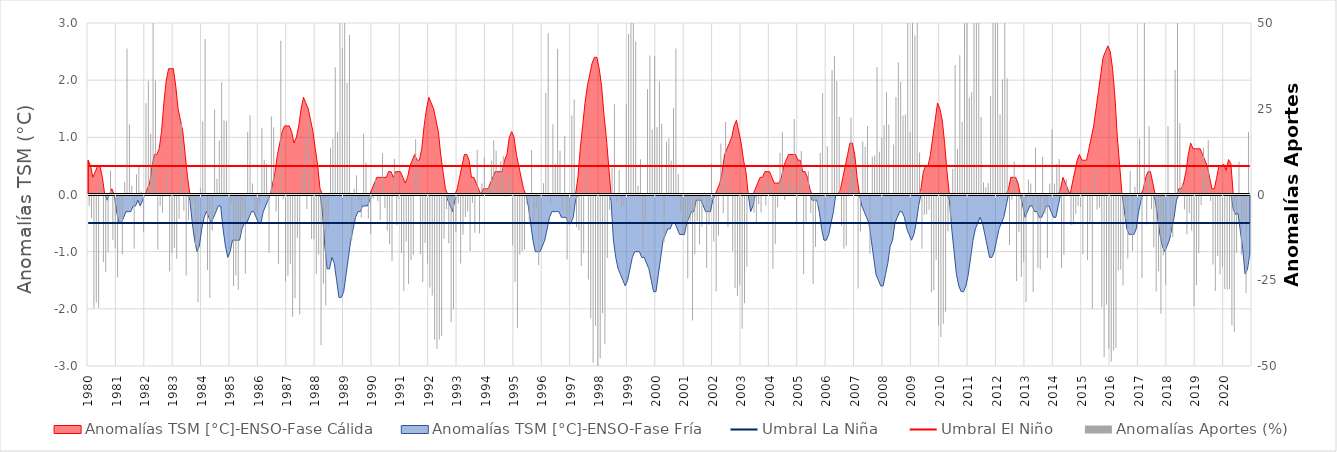
| Category | Anomalías Aportes (%) |
|---|---|
| 0 | -2.96 |
| 1 | -6.65 |
| 2 | -32.91 |
| 3 | -31.22 |
| 4 | -32.69 |
| 5 | 4.04 |
| 6 | -19.42 |
| 7 | -22.35 |
| 8 | -16.59 |
| 9 | 7.02 |
| 10 | -12.93 |
| 11 | -15.38 |
| 12 | -23.91 |
| 13 | -6.87 |
| 14 | -17.14 |
| 15 | 3.58 |
| 16 | 42.54 |
| 17 | 20.41 |
| 18 | 2.54 |
| 19 | -15.54 |
| 20 | 5.87 |
| 21 | 7.93 |
| 22 | 0.89 |
| 23 | -10.68 |
| 24 | 26.58 |
| 25 | 33.17 |
| 26 | 17.7 |
| 27 | 62.43 |
| 28 | 33.25 |
| 29 | -15.72 |
| 30 | -2.98 |
| 31 | -5.06 |
| 32 | -0.26 |
| 33 | 6.89 |
| 34 | -22.16 |
| 35 | -16.73 |
| 36 | -15.21 |
| 37 | -18.44 |
| 38 | -6.8 |
| 39 | 21.37 |
| 40 | -4.4 |
| 41 | -23.31 |
| 42 | -7.22 |
| 43 | -2.01 |
| 44 | -2.18 |
| 45 | -14.49 |
| 46 | -31.14 |
| 47 | 1.85 |
| 48 | 21.28 |
| 49 | 45.3 |
| 50 | -21.75 |
| 51 | -29.86 |
| 52 | -10.21 |
| 53 | 24.8 |
| 54 | 4.56 |
| 55 | 15.72 |
| 56 | 32.71 |
| 57 | 21.58 |
| 58 | 21.38 |
| 59 | -0.7 |
| 60 | -2.57 |
| 61 | -26.3 |
| 62 | -23.34 |
| 63 | -27.51 |
| 64 | -11.14 |
| 65 | -5.73 |
| 66 | -22.79 |
| 67 | 18.3 |
| 68 | 23.13 |
| 69 | 3.23 |
| 70 | -5.02 |
| 71 | -4.34 |
| 72 | -2.4 |
| 73 | 19.45 |
| 74 | 10.15 |
| 75 | 8.98 |
| 76 | -16.62 |
| 77 | 22.73 |
| 78 | 19.6 |
| 79 | -4.63 |
| 80 | -19.9 |
| 81 | 44.84 |
| 82 | -1.12 |
| 83 | -25.06 |
| 84 | -23.43 |
| 85 | -19.94 |
| 86 | -35.36 |
| 87 | -29.94 |
| 88 | -12.31 |
| 89 | -34.73 |
| 90 | 6.76 |
| 91 | 16.97 |
| 92 | -3.94 |
| 93 | 22.32 |
| 94 | -12.71 |
| 95 | -12.76 |
| 96 | -22.9 |
| 97 | -17.21 |
| 98 | -43.68 |
| 99 | -25.67 |
| 100 | -32.05 |
| 101 | -9.55 |
| 102 | 13.65 |
| 103 | 16.23 |
| 104 | 37.09 |
| 105 | 18.27 |
| 106 | 51.03 |
| 107 | 42.66 |
| 108 | 58.47 |
| 109 | 32.61 |
| 110 | 46.47 |
| 111 | -13.29 |
| 112 | 1.69 |
| 113 | 5.63 |
| 114 | -1.6 |
| 115 | -6.52 |
| 116 | 17.73 |
| 117 | 9.33 |
| 118 | -6.7 |
| 119 | -11.24 |
| 120 | -0.86 |
| 121 | 4.59 |
| 122 | -1.69 |
| 123 | -7.25 |
| 124 | 12.01 |
| 125 | -3.7 |
| 126 | -10.18 |
| 127 | -14.21 |
| 128 | -19.06 |
| 129 | 10.4 |
| 130 | -8.69 |
| 131 | -1.04 |
| 132 | -16.76 |
| 133 | -27.83 |
| 134 | -13.43 |
| 135 | -25.85 |
| 136 | -18.85 |
| 137 | -17.36 |
| 138 | 16.13 |
| 139 | 9.88 |
| 140 | -17.15 |
| 141 | -25.31 |
| 142 | -13.88 |
| 143 | -19.84 |
| 144 | -26.81 |
| 145 | -29.17 |
| 146 | -41.97 |
| 147 | -44.66 |
| 148 | -41.98 |
| 149 | -40.96 |
| 150 | -12.58 |
| 151 | -4.02 |
| 152 | -13.93 |
| 153 | -36.97 |
| 154 | -33.13 |
| 155 | -10.63 |
| 156 | -2.32 |
| 157 | -19.83 |
| 158 | -11.47 |
| 159 | -6.27 |
| 160 | -4.65 |
| 161 | -16.16 |
| 162 | -2.15 |
| 163 | -10.84 |
| 164 | 13.04 |
| 165 | -11.06 |
| 166 | 3.23 |
| 167 | 10.94 |
| 168 | 1.81 |
| 169 | 2.5 |
| 170 | 9.85 |
| 171 | 15.8 |
| 172 | 12.75 |
| 173 | 1.09 |
| 174 | 9.73 |
| 175 | 11.21 |
| 176 | -0.39 |
| 177 | 4.49 |
| 178 | 5.84 |
| 179 | -14.53 |
| 180 | -25.25 |
| 181 | -38.69 |
| 182 | -17.3 |
| 183 | -16.17 |
| 184 | -15.66 |
| 185 | -2.36 |
| 186 | -7.51 |
| 187 | 12.97 |
| 188 | -8.84 |
| 189 | -4.08 |
| 190 | -20.3 |
| 191 | 0.26 |
| 192 | 3.28 |
| 193 | 29.59 |
| 194 | 46.99 |
| 195 | -2.68 |
| 196 | 20.45 |
| 197 | 8.96 |
| 198 | 42.47 |
| 199 | 12.78 |
| 200 | -4.19 |
| 201 | 17.02 |
| 202 | -18.69 |
| 203 | -8.56 |
| 204 | 23 |
| 205 | 27.69 |
| 206 | -9.28 |
| 207 | -10.05 |
| 208 | -20.59 |
| 209 | -16.81 |
| 210 | 9.56 |
| 211 | -24.47 |
| 212 | -35.84 |
| 213 | -48.67 |
| 214 | -37.99 |
| 215 | -53.28 |
| 216 | -47.43 |
| 217 | -34.36 |
| 218 | -43.38 |
| 219 | -18.2 |
| 220 | -4.16 |
| 221 | 7.71 |
| 222 | 26.33 |
| 223 | -2.07 |
| 224 | 7.14 |
| 225 | -3.89 |
| 226 | -2.78 |
| 227 | 26.31 |
| 228 | 46.82 |
| 229 | 98.57 |
| 230 | 57.13 |
| 231 | 44.61 |
| 232 | 2.66 |
| 233 | 10.26 |
| 234 | -15.71 |
| 235 | -7.62 |
| 236 | 30.65 |
| 237 | 40.53 |
| 238 | 18.96 |
| 239 | 40.29 |
| 240 | 19.62 |
| 241 | 33.06 |
| 242 | 20.6 |
| 243 | -13.65 |
| 244 | 15.37 |
| 245 | 16.35 |
| 246 | 9.94 |
| 247 | 25.19 |
| 248 | 42.6 |
| 249 | 5.91 |
| 250 | -4.8 |
| 251 | -11.31 |
| 252 | -8.62 |
| 253 | -24.11 |
| 254 | -7.61 |
| 255 | -36.42 |
| 256 | -17.14 |
| 257 | -7.51 |
| 258 | -14.29 |
| 259 | -9.13 |
| 260 | 0.54 |
| 261 | -21.04 |
| 262 | -8.58 |
| 263 | 9.04 |
| 264 | -13.41 |
| 265 | -27.89 |
| 266 | -11.64 |
| 267 | 14.88 |
| 268 | -5.17 |
| 269 | 21.11 |
| 270 | -9.18 |
| 271 | 2.25 |
| 272 | -16.2 |
| 273 | -26.89 |
| 274 | -29.31 |
| 275 | -26.17 |
| 276 | -38.86 |
| 277 | -31.4 |
| 278 | -20.8 |
| 279 | -0.14 |
| 280 | -2.41 |
| 281 | -4.92 |
| 282 | -8.19 |
| 283 | -2.49 |
| 284 | -4.94 |
| 285 | 3.92 |
| 286 | -2.94 |
| 287 | 4.64 |
| 288 | 2.99 |
| 289 | -21.35 |
| 290 | -14.12 |
| 291 | -3.4 |
| 292 | 12.2 |
| 293 | 18.21 |
| 294 | -1.23 |
| 295 | 2.94 |
| 296 | 6.91 |
| 297 | 2.36 |
| 298 | 21.99 |
| 299 | -8.24 |
| 300 | 2.74 |
| 301 | 12.7 |
| 302 | -22.96 |
| 303 | -7.59 |
| 304 | 6.77 |
| 305 | -5.11 |
| 306 | -25.81 |
| 307 | -14.95 |
| 308 | -3.04 |
| 309 | 12.18 |
| 310 | 29.53 |
| 311 | -3.44 |
| 312 | 14.05 |
| 313 | -0.82 |
| 314 | 36.28 |
| 315 | 40.4 |
| 316 | 33.12 |
| 317 | 22.69 |
| 318 | -8.8 |
| 319 | -15.52 |
| 320 | -14.63 |
| 321 | 3.39 |
| 322 | 22.43 |
| 323 | 10.55 |
| 324 | 4.97 |
| 325 | -27.12 |
| 326 | -10.4 |
| 327 | 15.48 |
| 328 | 13.89 |
| 329 | 19.95 |
| 330 | -16.99 |
| 331 | 11.02 |
| 332 | 11.4 |
| 333 | 37.13 |
| 334 | 12.44 |
| 335 | 16.53 |
| 336 | 20.18 |
| 337 | 29.79 |
| 338 | 20.43 |
| 339 | -10.4 |
| 340 | 14.6 |
| 341 | 28.42 |
| 342 | 38.5 |
| 343 | 32.84 |
| 344 | 23.02 |
| 345 | 23.34 |
| 346 | 52.15 |
| 347 | 18.29 |
| 348 | 50.22 |
| 349 | 46.39 |
| 350 | 51.2 |
| 351 | 12.28 |
| 352 | -15.53 |
| 353 | -5.72 |
| 354 | -5.57 |
| 355 | -4.15 |
| 356 | -28.27 |
| 357 | -27.65 |
| 358 | -18.74 |
| 359 | -38 |
| 360 | -41.22 |
| 361 | -37.4 |
| 362 | -33.92 |
| 363 | -10.52 |
| 364 | -6.84 |
| 365 | 7.49 |
| 366 | 37.75 |
| 367 | 13.23 |
| 368 | 40.58 |
| 369 | 21.11 |
| 370 | 69.63 |
| 371 | 72.58 |
| 372 | 28.19 |
| 373 | 29.79 |
| 374 | 90.43 |
| 375 | 137.47 |
| 376 | 55.51 |
| 377 | 22.56 |
| 378 | 3.58 |
| 379 | 2.13 |
| 380 | 3.38 |
| 381 | 28.77 |
| 382 | 52.68 |
| 383 | 103.47 |
| 384 | 67.9 |
| 385 | 23.42 |
| 386 | 33.54 |
| 387 | 80.7 |
| 388 | 33.9 |
| 389 | -14.41 |
| 390 | -1.21 |
| 391 | 9.6 |
| 392 | -24.94 |
| 393 | -10.65 |
| 394 | -23.72 |
| 395 | -19.39 |
| 396 | -31.04 |
| 397 | 4.34 |
| 398 | 3.22 |
| 399 | -28.22 |
| 400 | 13.7 |
| 401 | -21.03 |
| 402 | -21.54 |
| 403 | 11 |
| 404 | -5.26 |
| 405 | -18.19 |
| 406 | 3.1 |
| 407 | 19.01 |
| 408 | 3.18 |
| 409 | 8.85 |
| 410 | 10.33 |
| 411 | -21.14 |
| 412 | -17.3 |
| 413 | 4.42 |
| 414 | -0.09 |
| 415 | -8.69 |
| 416 | -8.48 |
| 417 | -5.29 |
| 418 | -2.99 |
| 419 | -3.37 |
| 420 | -17.15 |
| 421 | 2.74 |
| 422 | -18.89 |
| 423 | -7.6 |
| 424 | -33.03 |
| 425 | 8.42 |
| 426 | -4.19 |
| 427 | -3.53 |
| 428 | -32.61 |
| 429 | -47.16 |
| 430 | -31.82 |
| 431 | -44.65 |
| 432 | -48.42 |
| 433 | -45.22 |
| 434 | -44.47 |
| 435 | -21.85 |
| 436 | -21.55 |
| 437 | -26.23 |
| 438 | -6.82 |
| 439 | -18.47 |
| 440 | 6.96 |
| 441 | -16.15 |
| 442 | 2.28 |
| 443 | 8.92 |
| 444 | 16.26 |
| 445 | -23.95 |
| 446 | 50.01 |
| 447 | -8.45 |
| 448 | 19.89 |
| 449 | -3.96 |
| 450 | -15.07 |
| 451 | -27.99 |
| 452 | -22.07 |
| 453 | -34.47 |
| 454 | -17.44 |
| 455 | -26 |
| 456 | 19.92 |
| 457 | -11.49 |
| 458 | -12.14 |
| 459 | 36.3 |
| 460 | 52 |
| 461 | 20.88 |
| 462 | 3.26 |
| 463 | -4.108 |
| 464 | -11.3 |
| 465 | -5.21 |
| 466 | -10.18 |
| 467 | -32.2 |
| 468 | -26.17 |
| 469 | -16.86 |
| 470 | -2.74 |
| 471 | 13.66 |
| 472 | 4.72 |
| 473 | 15.81 |
| 474 | -1.61 |
| 475 | -20.13 |
| 476 | -27.82 |
| 477 | -17.67 |
| 478 | -23.01 |
| 479 | -20.87 |
| 480 | -27.25 |
| 481 | -27.49 |
| 482 | -27.27 |
| 483 | -37.82 |
| 484 | -39.79 |
| 485 | -16.71 |
| 486 | 9.54 |
| 487 | -17.23 |
| 488 | -7.19 |
| 489 | -28.48 |
| 490 | 18.33 |
| 491 | -7.97 |